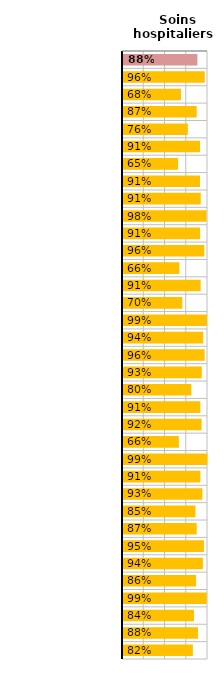
| Category | Soins hospitaliers |
|---|---|
| OCDE32 | 0.875 |
| Allemagne | 0.962 |
| Australie | 0.682 |
| Autriche | 0.867 |
| Belgique | 0.763 |
| Canada | 0.906 |
| Corée | 0.648 |
| Danemark | 0.906 |
| Espagne | 0.915 |
| Estonie | 0.982 |
| Finlande | 0.907 |
| France | 0.956 |
| Grèce | 0.663 |
| Hongrie | 0.913 |
| Irlande | 0.698 |
| Islande | 0.988 |
| Israël | 0.943 |
| Italie | 0.96 |
| Japon | 0.927 |
| Lettonie | 0.803 |
| Lituanie | 0.91 |
| Luxembourg | 0.925 |
| Mexique | 0.657 |
| Norvège | 0.993 |
| Pays-Bas | 0.91 |
| Pologne | 0.934 |
| Portugal | 0.853 |
| République slovaque | 0.867 |
| République tchèque | 0.952 |
| Royaume-Uni | 0.94 |
| Slovénie | 0.86 |
| Suède | 0.986 |
| Suisse | 0.836 |
| Costa Rica | 0.883 |
| Fédération de Russie | 0.822 |